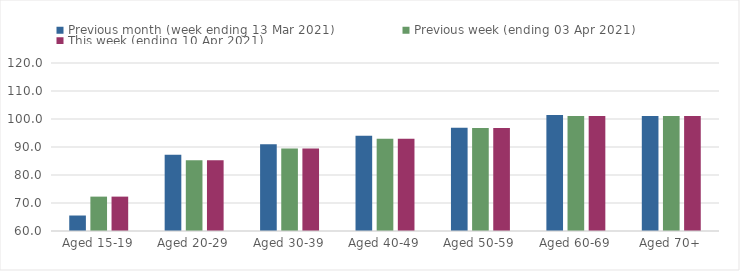
| Category | Previous month (week ending 13 Mar 2021) | Previous week (ending 03 Apr 2021) | This week (ending 10 Apr 2021) |
|---|---|---|---|
| Aged 15-19 | 65.53 | 72.28 | 72.28 |
| Aged 20-29 | 87.24 | 85.3 | 85.3 |
| Aged 30-39 | 91.01 | 89.49 | 89.49 |
| Aged 40-49 | 94.06 | 92.94 | 92.94 |
| Aged 50-59 | 96.87 | 96.78 | 96.78 |
| Aged 60-69 | 101.42 | 101.04 | 101.04 |
| Aged 70+ | 101.1 | 101.04 | 101.04 |